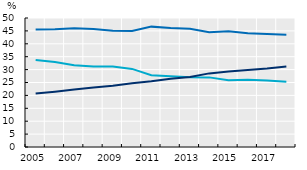
| Category | Low | Medium | High |
|---|---|---|---|
| 2005.0 | 33.729 | 45.552 | 20.719 |
| 2006.0 | 32.905 | 45.649 | 21.446 |
| 2007.0 | 31.659 | 46.042 | 22.299 |
| 2008.0 | 31.17 | 45.768 | 23.061 |
| 2009.0 | 31.18 | 45.084 | 23.735 |
| 2010.0 | 30.277 | 44.99 | 24.733 |
| 2011.0 | 27.822 | 46.656 | 25.523 |
| 2012.0 | 27.423 | 46.096 | 26.482 |
| 2013.0 | 26.991 | 45.844 | 27.165 |
| 2014.0 | 26.985 | 44.48 | 28.535 |
| 2015.0 | 25.869 | 44.832 | 29.3 |
| 2016.0 | 26.071 | 44.106 | 29.824 |
| 2017.0 | 25.804 | 43.806 | 30.39 |
| 2018.0 | 25.291 | 43.521 | 31.188 |